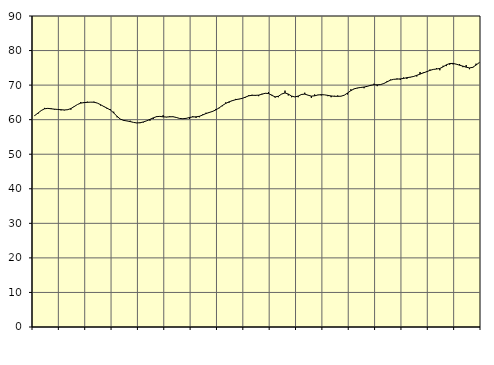
| Category | Piggar | Series 1 |
|---|---|---|
| nan | 61.3 | 61.18 |
| 87.0 | 61.7 | 61.9 |
| 87.0 | 62.6 | 62.64 |
| 87.0 | 63.4 | 63.15 |
| nan | 63.2 | 63.27 |
| 88.0 | 63.3 | 63.15 |
| 88.0 | 62.9 | 63.04 |
| 88.0 | 63 | 62.96 |
| nan | 62.7 | 62.88 |
| 89.0 | 62.7 | 62.81 |
| 89.0 | 62.8 | 62.88 |
| 89.0 | 62.9 | 63.21 |
| nan | 63.9 | 63.79 |
| 90.0 | 64.4 | 64.39 |
| 90.0 | 65.1 | 64.79 |
| 90.0 | 65.1 | 64.94 |
| nan | 65.2 | 65.01 |
| 91.0 | 65.1 | 65.07 |
| 91.0 | 65.2 | 65.05 |
| 91.0 | 64.8 | 64.81 |
| nan | 64.1 | 64.34 |
| 92.0 | 63.7 | 63.81 |
| 92.0 | 63.1 | 63.33 |
| 92.0 | 63 | 62.78 |
| nan | 62.3 | 61.96 |
| 93.0 | 60.7 | 60.97 |
| 93.0 | 60.1 | 60.18 |
| 93.0 | 59.9 | 59.79 |
| nan | 59.6 | 59.64 |
| 94.0 | 59.7 | 59.45 |
| 94.0 | 59.2 | 59.21 |
| 94.0 | 59 | 59.06 |
| nan | 59 | 59.11 |
| 95.0 | 59.2 | 59.34 |
| 95.0 | 59.7 | 59.66 |
| 95.0 | 59.7 | 60.08 |
| nan | 60.2 | 60.52 |
| 96.0 | 61 | 60.87 |
| 96.0 | 60.9 | 60.95 |
| 96.0 | 61.3 | 60.82 |
| nan | 60.7 | 60.76 |
| 97.0 | 61 | 60.83 |
| 97.0 | 60.8 | 60.85 |
| 97.0 | 60.7 | 60.64 |
| nan | 60.4 | 60.36 |
| 98.0 | 60.3 | 60.27 |
| 98.0 | 60.3 | 60.38 |
| 98.0 | 60.2 | 60.63 |
| nan | 61 | 60.79 |
| 99.0 | 60.5 | 60.82 |
| 99.0 | 60.7 | 60.97 |
| 99.0 | 61.5 | 61.35 |
| nan | 62 | 61.77 |
| 0.0 | 62.2 | 62.08 |
| 0.0 | 62.5 | 62.39 |
| 0.0 | 63.1 | 62.82 |
| nan | 63.3 | 63.42 |
| 1.0 | 63.9 | 64.1 |
| 1.0 | 65 | 64.69 |
| 1.0 | 64.9 | 65.15 |
| nan | 65.6 | 65.49 |
| 2.0 | 66 | 65.78 |
| 2.0 | 65.9 | 65.96 |
| 2.0 | 66.1 | 66.15 |
| nan | 66.4 | 66.53 |
| 3.0 | 67.1 | 66.9 |
| 3.0 | 67.2 | 67.05 |
| 3.0 | 66.9 | 67.04 |
| nan | 66.8 | 67.1 |
| 4.0 | 67.5 | 67.36 |
| 4.0 | 67.7 | 67.64 |
| 4.0 | 68 | 67.57 |
| nan | 67.2 | 67.05 |
| 5.0 | 66.4 | 66.59 |
| 5.0 | 66.5 | 66.78 |
| 5.0 | 67.4 | 67.43 |
| nan | 68.4 | 67.74 |
| 6.0 | 67 | 67.41 |
| 6.0 | 66.5 | 66.83 |
| 6.0 | 66.6 | 66.57 |
| nan | 66.5 | 66.83 |
| 7.0 | 67.4 | 67.29 |
| 7.0 | 67.8 | 67.4 |
| 7.0 | 67.1 | 67.08 |
| nan | 66.3 | 66.81 |
| 8.0 | 67.3 | 66.9 |
| 8.0 | 67.2 | 67.14 |
| 8.0 | 67 | 67.24 |
| nan | 67.2 | 67.18 |
| 9.0 | 66.8 | 67.03 |
| 9.0 | 66.5 | 66.86 |
| 9.0 | 66.9 | 66.76 |
| nan | 67 | 66.75 |
| 10.0 | 66.8 | 66.79 |
| 10.0 | 67.1 | 67.08 |
| 10.0 | 67.3 | 67.72 |
| nan | 68.8 | 68.41 |
| 11.0 | 69 | 68.91 |
| 11.0 | 69.1 | 69.18 |
| 11.0 | 69.4 | 69.32 |
| nan | 69.1 | 69.44 |
| 12.0 | 69.7 | 69.65 |
| 12.0 | 69.8 | 69.95 |
| 12.0 | 70.4 | 70.1 |
| nan | 69.7 | 70.09 |
| 13.0 | 70.2 | 70.15 |
| 13.0 | 70.5 | 70.46 |
| 13.0 | 71.2 | 70.95 |
| nan | 71.6 | 71.43 |
| 14.0 | 71.7 | 71.68 |
| 14.0 | 71.9 | 71.74 |
| 14.0 | 71.5 | 71.8 |
| nan | 72.2 | 71.94 |
| 15.0 | 71.8 | 72.15 |
| 15.0 | 72.2 | 72.3 |
| 15.0 | 72.6 | 72.49 |
| nan | 72.5 | 72.83 |
| 16.0 | 73.8 | 73.18 |
| 16.0 | 73.7 | 73.54 |
| 16.0 | 74 | 73.88 |
| nan | 74.5 | 74.26 |
| 17.0 | 74.5 | 74.54 |
| 17.0 | 74.9 | 74.65 |
| 17.0 | 74.3 | 74.82 |
| nan | 75.6 | 75.29 |
| 18.0 | 75.5 | 75.88 |
| 18.0 | 75.9 | 76.25 |
| 18.0 | 76 | 76.28 |
| nan | 76 | 76.06 |
| 19.0 | 76.1 | 75.76 |
| 19.0 | 75.2 | 75.49 |
| 19.0 | 75.8 | 75.19 |
| nan | 74.6 | 74.97 |
| 20.0 | 75 | 75.15 |
| 20.0 | 76.2 | 75.81 |
| 20.0 | 76.6 | 76.53 |